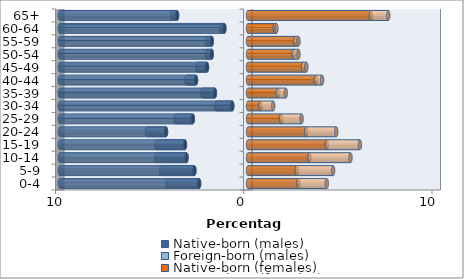
| Category | Native-born (males) | Foreign-born (males) | Native-born (females) | Foreign-born (females) |
|---|---|---|---|---|
| 0-4 | -2.596 | -1.675 | 2.68 | 1.508 |
| 5-9 | -2.848 | -1.759 | 2.596 | 1.926 |
| 10-14 | -3.266 | -1.591 | 3.266 | 2.178 |
| 15-19 | -3.35 | -1.508 | 4.188 | 1.759 |
| 20-24 | -4.355 | -1.005 | 3.099 | 1.591 |
| 25-29 | -2.931 | -0.921 | 1.759 | 1.089 |
| 30-34 | -0.838 | -0.838 | 0.67 | 0.67 |
| 35-39 | -1.759 | -0.67 | 1.591 | 0.419 |
| 40-44 | -2.764 | -0.503 | 3.601 | 0.335 |
| 45-49 | -2.178 | -0.503 | 2.931 | 0.168 |
| 50-54 | -1.926 | -0.251 | 2.429 | 0.251 |
| 55-59 | -1.926 | -0.251 | 2.513 | 0.168 |
| 60-64 | -1.256 | -0.168 | 1.424 | 0.084 |
| 65+ | -3.769 | -0.251 | 6.533 | 0.921 |